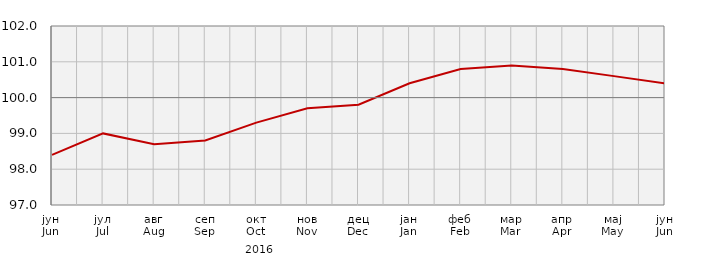
| Category | Series 0 |
|---|---|
| јун
Jun | 98.4 |
| јул
Jul | 99 |
| авг
Aug | 98.7 |
| сеп
Sep | 98.8 |
| окт
Oct | 99.3 |
| нов
Nov | 99.7 |
| дец
Dec | 99.8 |
| јан
Jan | 100.4 |
| феб
Feb | 100.8 |
| мар
Mar | 100.9 |
| апр
Apr | 100.8 |
| мај
May | 100.6 |
| јун
Jun | 100.4 |